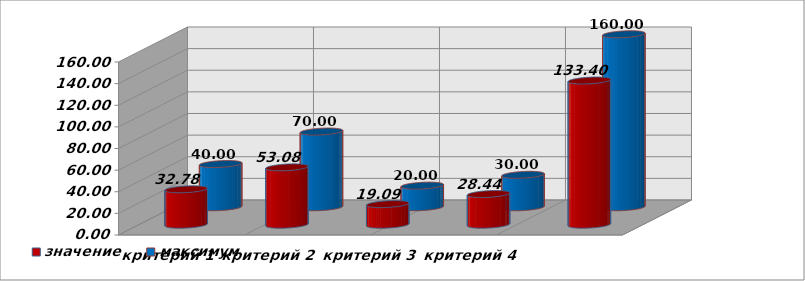
| Category | значение | максимум |
|---|---|---|
| критерий 1 | 32.784 | 40 |
| критерий 2 | 53.081 | 70 |
| критерий 3 | 19.095 | 20 |
| критерий 4 | 28.437 | 30 |